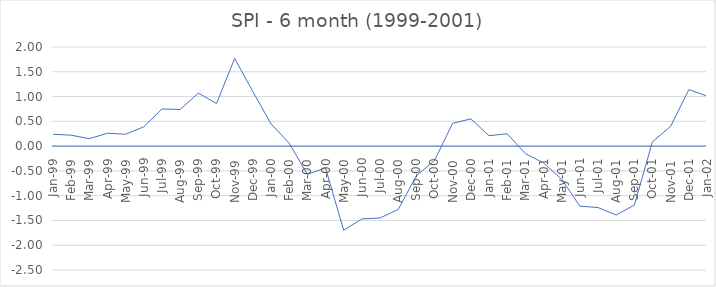
| Category | SPI - 4 month |
|---|---|
| Jan-99 | 0.24 |
| Feb-99 | 0.22 |
| Mar-99 | 0.15 |
| Apr-99 | 0.26 |
| May-99 | 0.24 |
| Jun-99 | 0.39 |
| Jul-99 | 0.75 |
| Aug-99 | 0.74 |
| Sep-99 | 1.07 |
| Oct-99 | 0.86 |
| Nov-99 | 1.77 |
| Dec-99 | 1.1 |
| Jan-00 | 0.45 |
| Feb-00 | 0.06 |
| Mar-00 | -0.57 |
| Apr-00 | -0.44 |
| May-00 | -1.7 |
| Jun-00 | -1.47 |
| Jul-00 | -1.45 |
| Aug-00 | -1.28 |
| Sep-00 | -0.6 |
| Oct-00 | -0.29 |
| Nov-00 | 0.46 |
| Dec-00 | 0.55 |
| Jan-01 | 0.21 |
| Feb-01 | 0.25 |
| Mar-01 | -0.15 |
| Apr-01 | -0.34 |
| May-01 | -0.67 |
| Jun-01 | -1.21 |
| Jul-01 | -1.24 |
| Aug-01 | -1.39 |
| Sep-01 | -1.19 |
| Oct-01 | 0.09 |
| Nov-01 | 0.4 |
| Dec-01 | 1.14 |
| Jan-02 | 1.01 |